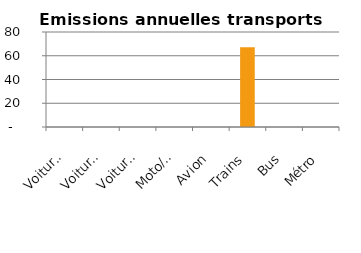
| Category | kg eq CO2 |
|---|---|
| Voiture ess/gazoil | 0 |
| Voiture gaz (GPL) | 0 |
| Voiture électrique | 0 |
| Moto/Scooter/Mobilette | 0 |
| Avion | 0 |
| Trains | 67.2 |
| Bus | 0 |
| Métro | 0 |